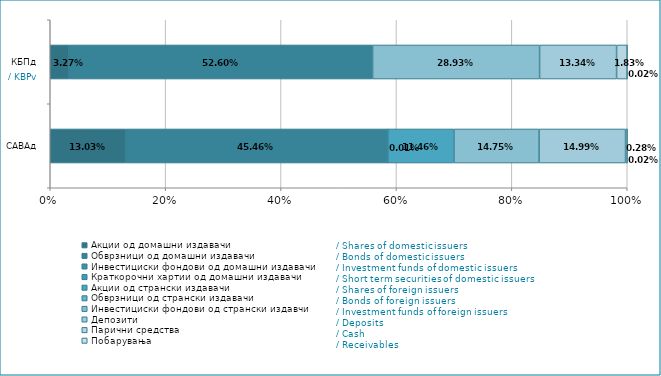
| Category | Акции од домашни издавачи  | Обврзници од домашни издавачи  | Инвестициски фондови од домашни издавачи   | Краткорочни хартии од домашни издавачи   | Акции од странски издавачи   | Обврзници од странски издавачи  | Инвестициски фондови од странски издавчи  | Депозити | Парични средства | Побарувања |
|---|---|---|---|---|---|---|---|---|---|---|
| САВАд | 0.13 | 0.455 | 0 | 0 | 0.115 | 0 | 0.148 | 0.15 | 0.003 | 0 |
| КБПд | 0.033 | 0.526 | 0 | 0 | 0 | 0 | 0.289 | 0.133 | 0.018 | 0 |